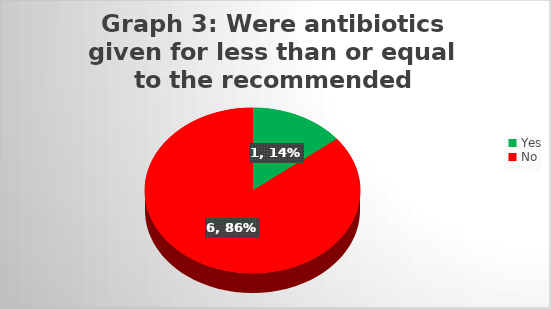
| Category | Series 0 |
|---|---|
| Yes | 1 |
| No | 6 |